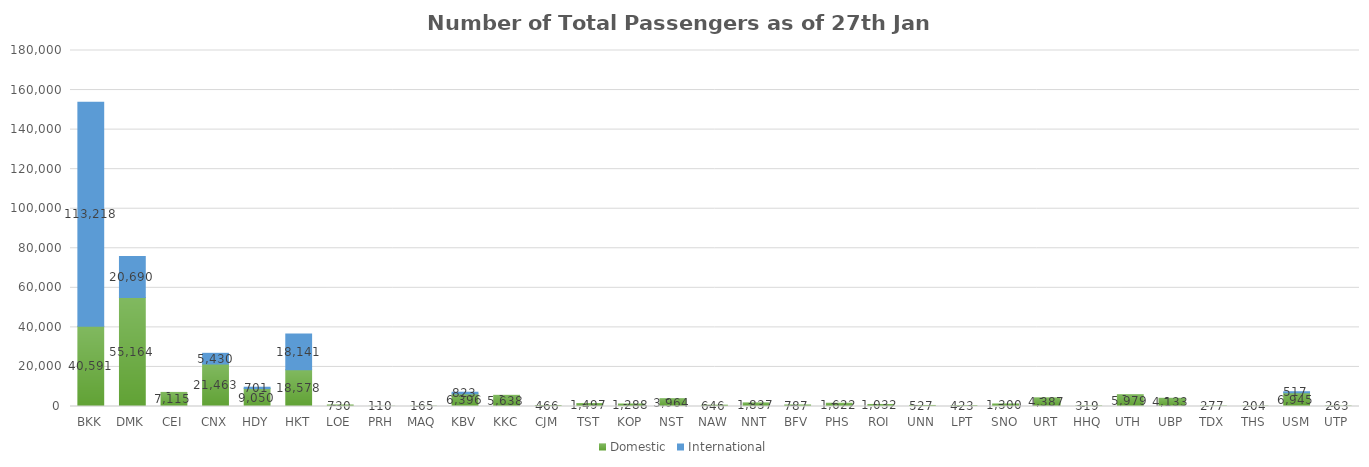
| Category | Domestic | International |
|---|---|---|
| BKK | 40591 | 113218 |
| DMK | 55164 | 20690 |
| CEI | 7115 | 0 |
| CNX | 21463 | 5430 |
| HDY | 9050 | 701 |
| HKT | 18578 | 18141 |
| LOE | 730 | 0 |
| PRH | 110 | 0 |
| MAQ | 165 | 0 |
| KBV | 6396 | 823 |
| KKC | 5638 | 0 |
| CJM | 466 | 0 |
| TST | 1497 | 0 |
| KOP | 1288 | 0 |
| NST | 3964 | 0 |
| NAW | 646 | 0 |
| NNT | 1837 | 0 |
| BFV | 787 | 0 |
| PHS | 1622 | 0 |
| ROI | 1032 | 0 |
| UNN | 527 | 0 |
| LPT | 423 | 0 |
| SNO | 1300 | 0 |
| URT | 4387 | 0 |
| HHQ | 319 | 0 |
| UTH | 5979 | 0 |
| UBP | 4133 | 0 |
| TDX | 277 | 0 |
| THS | 204 | 0 |
| USM | 6945 | 517 |
| UTP | 263 | 0 |